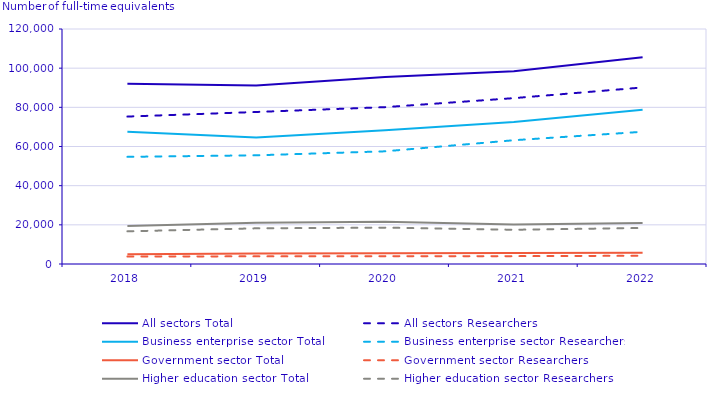
| Category | All sectors | Business enterprise sector | Government sector | Higher education sector |
|---|---|---|---|---|
| 2018 | 75289 | 54720 | 3838 | 16676 |
| 2019 | 77629 | 55498 | 3914 | 18217 |
| 2020 | 80089 | 57538 | 3980 | 18571 |
| 2021 | 84695 | 63200 | 4011 | 17484 |
| 2022 | 90142 | 67521 | 4212 | 18409 |